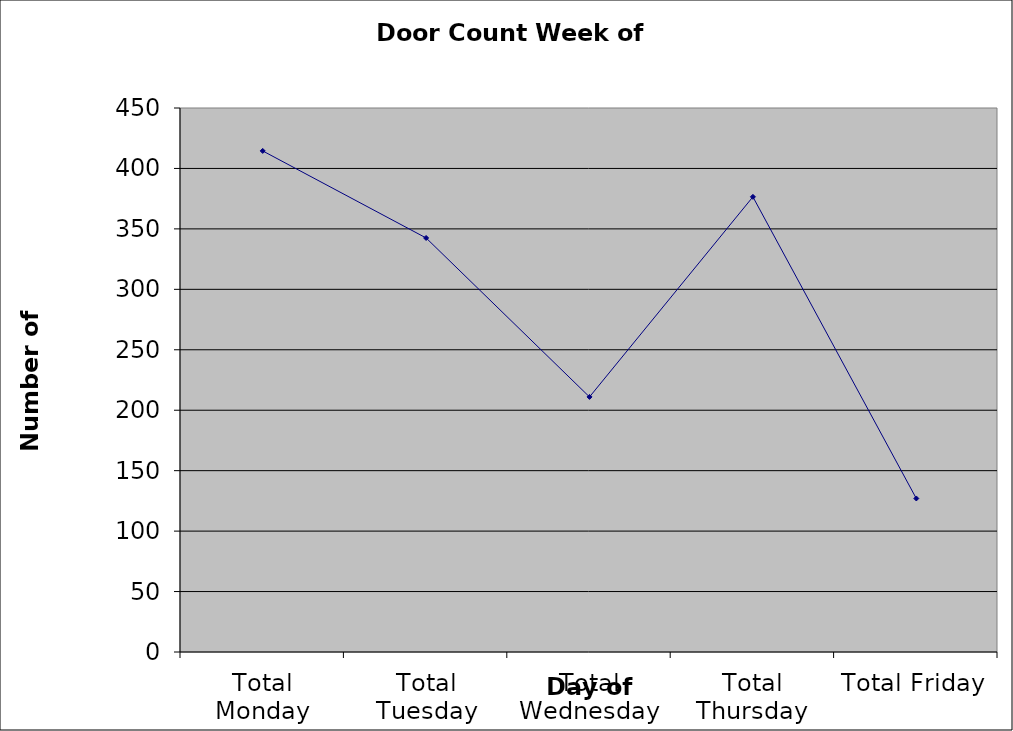
| Category | Series 0 |
|---|---|
| Total Monday | 414.5 |
| Total Tuesday | 342.5 |
| Total Wednesday | 211 |
| Total Thursday | 376.5 |
| Total Friday | 127 |